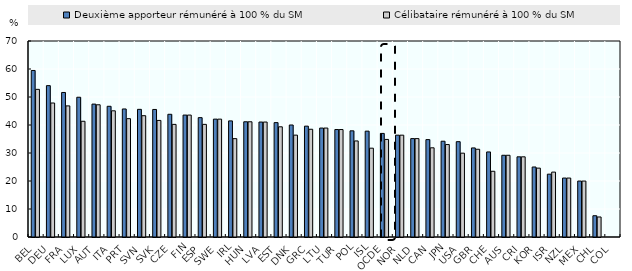
| Category | Deuxième apporteur rémunéré à 100 % du SM | Célibataire rémunéré à 100 % du SM |
|---|---|---|
| BEL | 59.471 | 52.729 |
| DEU | 54.059 | 47.853 |
| FRA | 51.614 | 46.826 |
| LUX | 49.913 | 41.331 |
| AUT | 47.465 | 47.225 |
| ITA | 46.682 | 45.071 |
| PRT | 45.728 | 42.264 |
| SVN | 45.587 | 43.321 |
| SVK | 45.55 | 41.633 |
| CZE | 43.823 | 40.22 |
| FIN | 43.547 | 43.547 |
| ESP | 42.625 | 40.228 |
| SWE | 42.094 | 42.094 |
| IRL | 41.465 | 35.129 |
| HUN | 41.15 | 41.15 |
| LVA | 41.058 | 41.058 |
| EST | 40.848 | 39.353 |
| DNK | 40.005 | 36.381 |
| GRC | 39.59 | 38.479 |
| LTU | 38.908 | 38.908 |
| TUR | 38.38 | 38.38 |
| POL | 37.917 | 34.308 |
| ISL | 37.805 | 31.721 |
| OCDE | 36.998 | 34.845 |
| NOR | 36.368 | 36.368 |
| NLD | 35.141 | 35.141 |
| CAN | 34.788 | 31.857 |
| JPN | 34.202 | 33.02 |
| USA | 34.044 | 29.941 |
| GBR | 31.808 | 31.338 |
| CHE | 30.374 | 23.472 |
| AUS | 29.19 | 29.19 |
| CRI | 28.633 | 28.633 |
| KOR | 25.005 | 24.596 |
| ISR | 22.441 | 23.178 |
| NZL | 21.053 | 21.053 |
| MEX | 19.98 | 19.98 |
| CHL | 7.598 | 7.149 |
| COL | 0 | 0 |